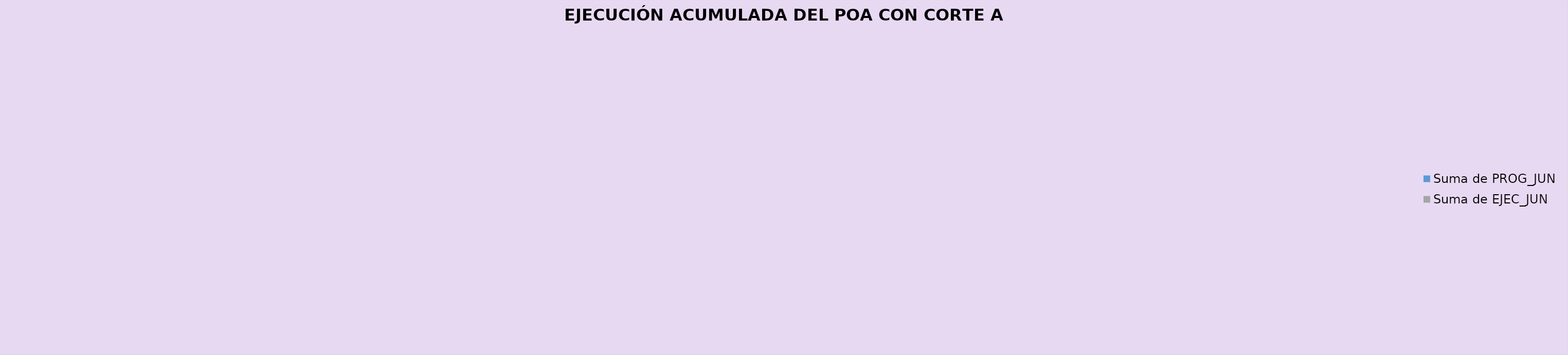
| Category | Suma de PROG_JUN | Suma de EJEC_JUN |
|---|---|---|
| Administración de Bienes e Infraestructura | 0.46 | 0.46 |
| Atención a la Ciudadanía | 0.47 | 0.48 |
| Comunicación Estratégica | 0.39 | 0.33 |
| Control Interno Disciplinario | 0.4 | 0.3 |
| Direccionamiento Estratégico | 0.55 | 0.53 |
| Fortalecimiento del Sistema Integrado de Gestión | 0.46 | 0.45 |
| Gestión Contractual | 0.39 | 0.32 |
| Gestión de Sistemas de Información y Tecnología | 0.36 | 0.3 |
| Gestión del Talento Humano | 0.47 | 0.39 |
| Gestión Documental | 0.37 | 0.37 |
| Gestión Financiera | 0.28 | 0.28 |
| Gestión Jurídica | 0.51 | 0.38 |
| Protección e Intervención del Patrimonio | 0.64 | 0.43 |
| Divulgación y Apropiación Social del Patrimonio | 0.53 | 0.53 |
| Gestión Territorial del Patrimonio | 0.39 | 0.27 |